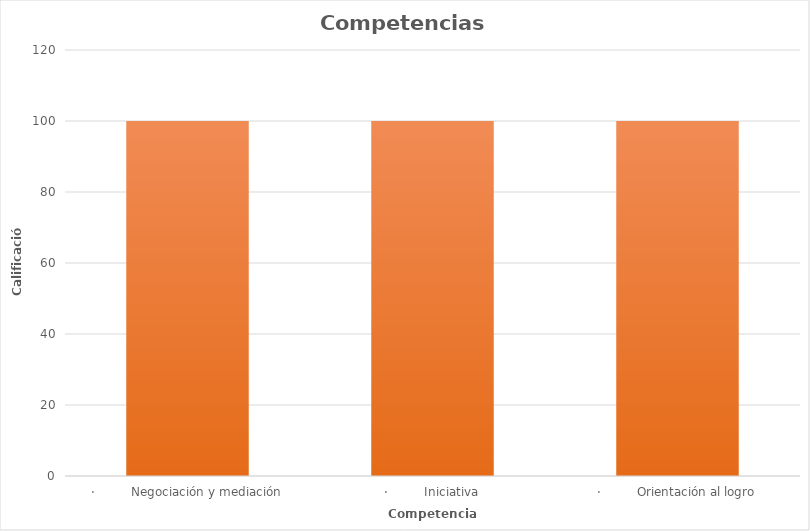
| Category | Series 0 |
|---|---|
| ·         Negociación y mediación | 100 |
| ·         Iniciativa | 100 |
| ·         Orientación al logro | 100 |